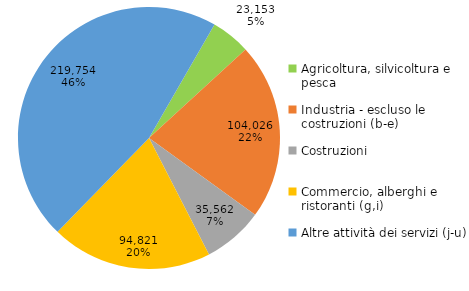
| Category | Series 0 |
|---|---|
| Agricoltura, silvicoltura e pesca | 23153 |
| Industria - escluso le costruzioni (b-e) | 104026 |
| Costruzioni | 35562 |
| Commercio, alberghi e ristoranti (g,i) | 94821 |
| Altre attività dei servizi (j-u) | 219754 |